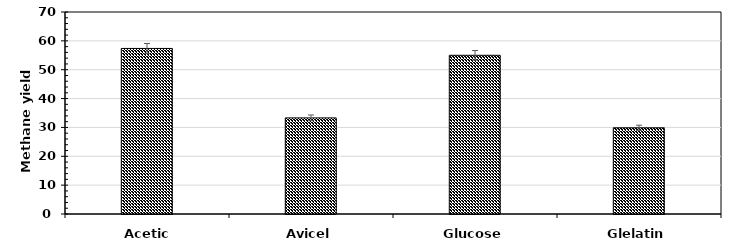
| Category | Series 0 |
|---|---|
| Acetic acid | 57.372 |
| Avicel | 33.31 |
| Glucose | 55 |
| Glelatin | 29.874 |